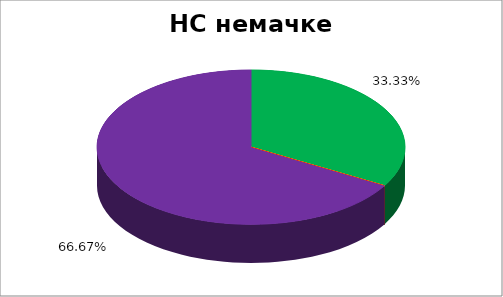
| Category | НС немачке НМ |
|---|---|
| 0 | 0.333 |
| 1 | 0 |
| 2 | 0 |
| 3 | 0 |
| 4 | 0.667 |